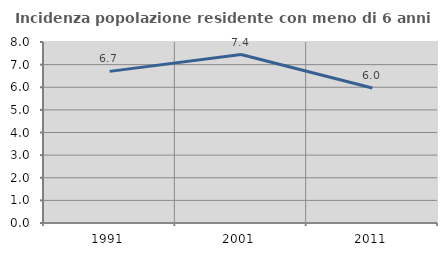
| Category | Incidenza popolazione residente con meno di 6 anni |
|---|---|
| 1991.0 | 6.702 |
| 2001.0 | 7.446 |
| 2011.0 | 5.969 |